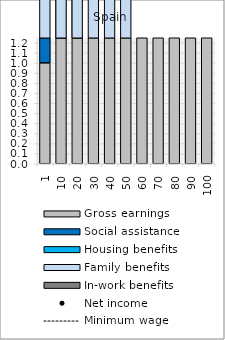
| Category | Gross earnings | Social assistance | Housing benefits | Family benefits | In-work benefits |
|---|---|---|---|---|---|
| 1.0 | 1.001 | 23.135 | 0 | 2.198 | 0 |
| 10.0 | 10.002 | 14.138 | 0 | 2.198 | 0 |
| 20.0 | 20 | 4.136 | 0 | 2.198 | 0 |
| 30.0 | 30.002 | 0 | 0 | 2.198 | 0 |
| 40.0 | 40 | 0 | 0 | 2.198 | 0 |
| 50.0 | 50.002 | 0 | 0 | 2.198 | 0 |
| 60.0 | 60 | 0 | 0 | 0 | 0 |
| 70.0 | 70.002 | 0 | 0 | 0 | 0 |
| 80.0 | 80 | 0 | 0 | 0 | 0 |
| 90.0 | 90.002 | 0 | 0 | 0 | 0 |
| 100.0 | 100 | 0 | 0 | 0 | 0 |